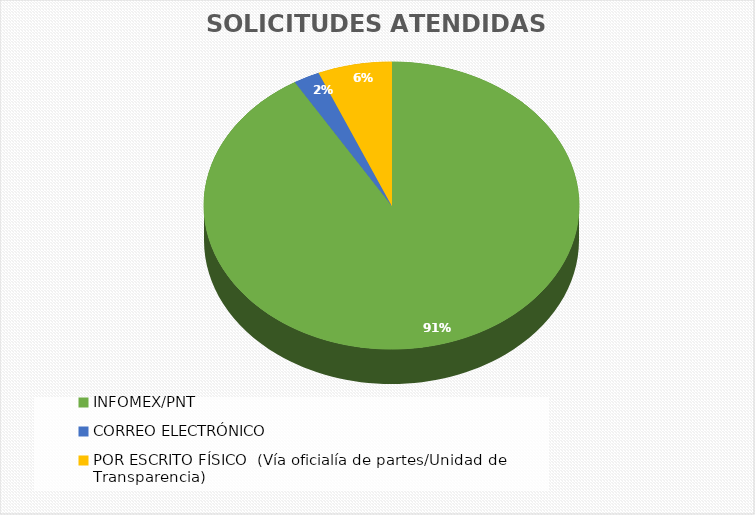
| Category | Series 0 |
|---|---|
| INFOMEX/PNT | 1859 |
| CORREO ELECTRÓNICO | 46 |
| POR ESCRITO FÍSICO  (Vía oficialía de partes/Unidad de Transparencia) | 129 |